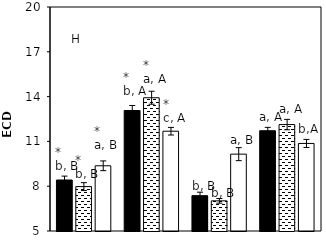
| Category |    A. brasilense |    A. chroococcum |    CK |
|---|---|---|---|
| aCO2-Bt | 8.415 | 7.973 | 9.368 |
| aCO2-XIANYU | 13.068 | 13.924 | 11.682 |
| eCO2-Bt | 7.365 | 7.02 | 10.147 |
| eCO2-XIANYU | 11.714 | 12.127 | 10.863 |